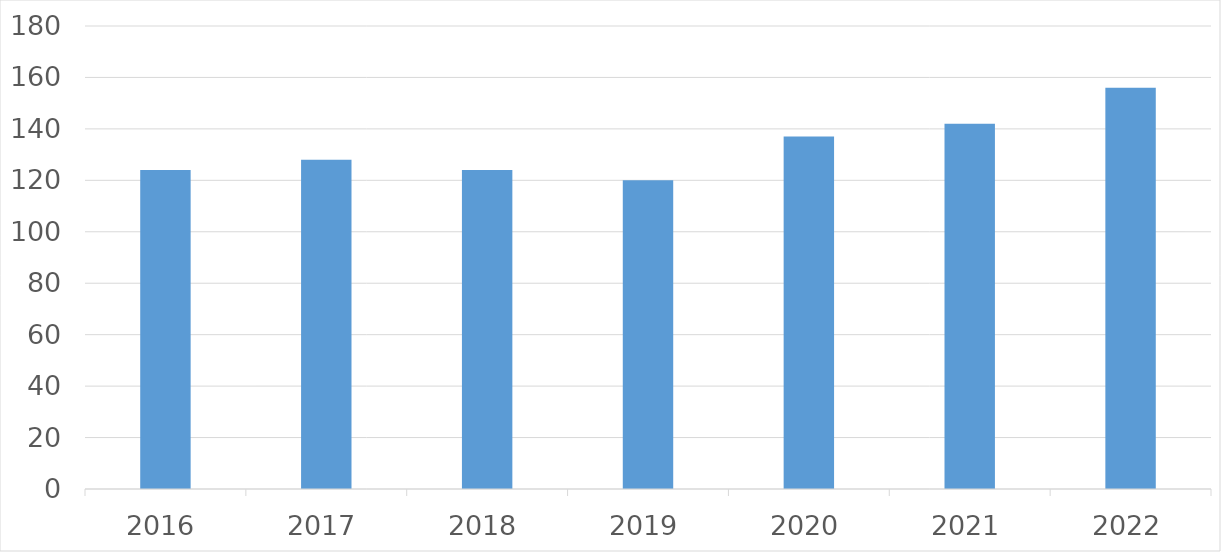
| Category | Series 0 |
|---|---|
| 2016 | 124 |
| 2017 | 128 |
| 2018 | 124 |
| 2019 | 120 |
| 2020 | 137 |
| 2021 | 142 |
| 2022 | 156 |